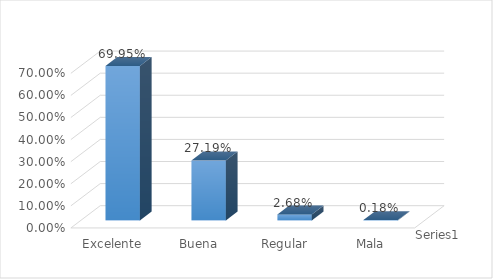
| Category | Series 0 |
|---|---|
| Excelente | 0.699 |
| Buena | 0.272 |
| Regular | 0.027 |
| Mala | 0.002 |